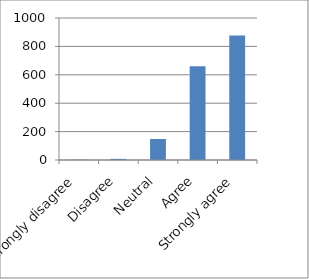
| Category | Series 0 |
|---|---|
| Strongly disagree | 2 |
| Disagree | 8 |
| Neutral | 148 |
|  Agree | 661 |
| Strongly agree | 876 |